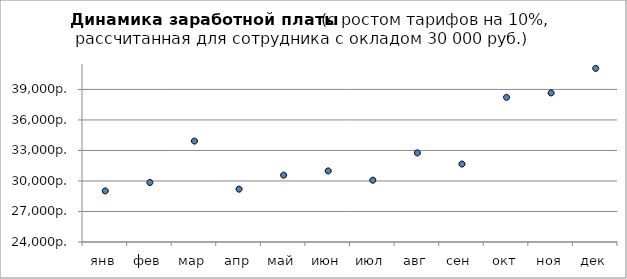
| Category | Series 0 |
|---|---|
| янв | 29022.365 |
| фев | 29851.172 |
| мар | 33924.838 |
| апр | 29194.313 |
| май | 30572.424 |
| июн | 30988.894 |
| июл | 30074.839 |
| авг | 32756.656 |
| сен | 31664.969 |
| окт | 38223.553 |
| ноя | 38657.355 |
| дек | 41068.624 |